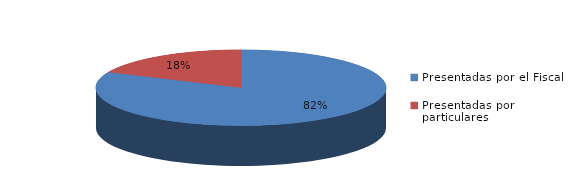
| Category | Series 0 |
|---|---|
| Presentadas por el Fiscal | 147 |
| Presentadas por particulares | 33 |